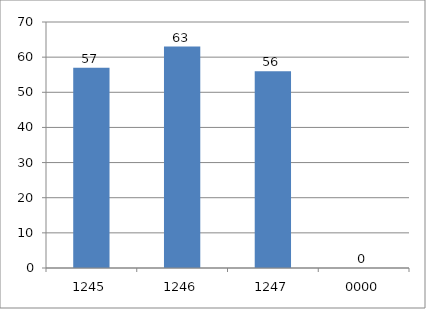
| Category | Series 0 |
|---|---|
| 1245.0 | 57 |
| 1246.0 | 63 |
| 1247.0 | 56 |
| 0.0 | 0 |